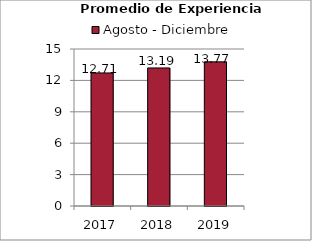
| Category | Agosto - Diciembre |
|---|---|
| 2017.0 | 12.71 |
| 2018.0 | 13.19 |
| 2019.0 | 13.77 |